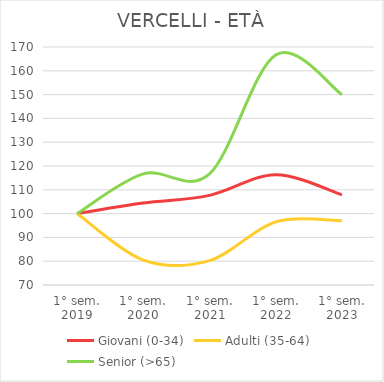
| Category | Giovani (0-34) | Adulti (35-64) | Senior (>65) |
|---|---|---|---|
| 1° sem.
2019 | 100 | 100 | 100 |
| 1° sem.
2020 | 104.435 | 80.477 | 116.667 |
| 1° sem.
2021 | 107.661 | 80.26 | 116.667 |
| 1° sem.
2022 | 116.331 | 96.529 | 166.667 |
| 1° sem.
2023 | 107.863 | 96.963 | 150 |